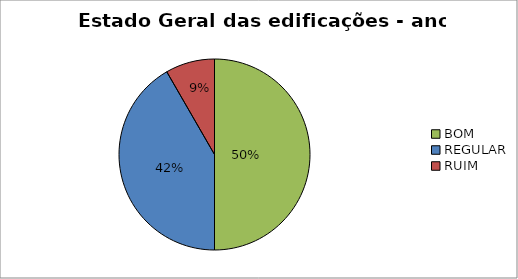
| Category | Series 0 |
|---|---|
| BOM | 6 |
| REGULAR | 5 |
| RUIM | 1 |